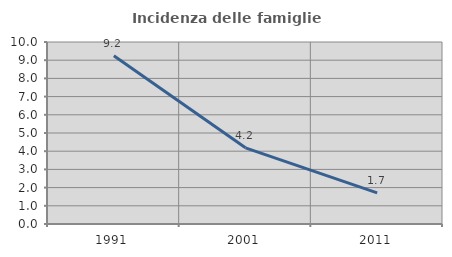
| Category | Incidenza delle famiglie numerose |
|---|---|
| 1991.0 | 9.239 |
| 2001.0 | 4.184 |
| 2011.0 | 1.711 |